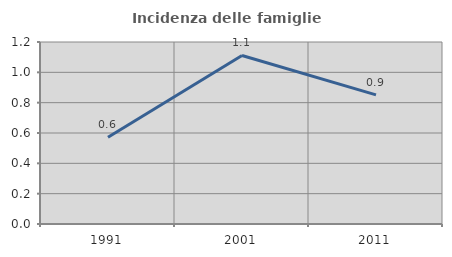
| Category | Incidenza delle famiglie numerose |
|---|---|
| 1991.0 | 0.571 |
| 2001.0 | 1.111 |
| 2011.0 | 0.851 |